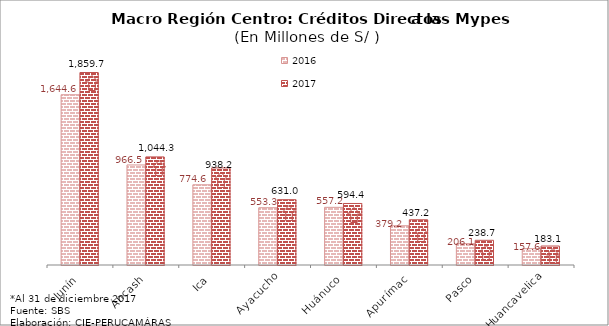
| Category | 2016 | 2017 |
|---|---|---|
| Junín | 1644.571 | 1859.662 |
| Áncash | 966.499 | 1044.326 |
| Ica | 774.601 | 938.243 |
| Ayacucho | 553.278 | 630.97 |
| Huánuco | 557.168 | 594.432 |
| Apurímac | 379.159 | 437.218 |
| Pasco | 206.12 | 238.669 |
| Huancavelica | 157.584 | 183.14 |